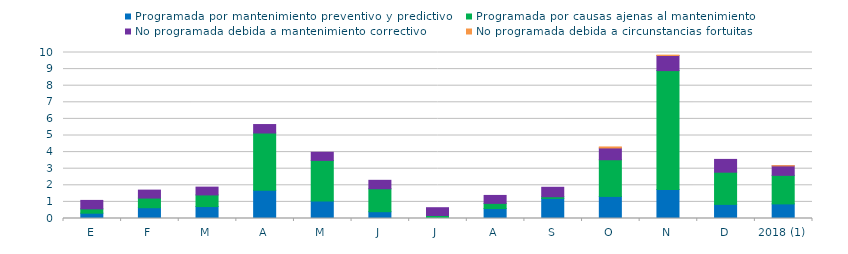
| Category | Programada por mantenimiento preventivo y predictivo | Programada por causas ajenas al mantenimiento  | No programada debida a mantenimiento correctivo  | No programada debida a circunstancias fortuitas  |
|---|---|---|---|---|
| E | 0.32 | 0.26 | 0.51 | 0 |
| F | 0.65 | 0.58 | 0.48 | 0 |
| M | 0.72 | 0.7 | 0.47 | 0 |
| A | 1.7 | 3.45 | 0.51 | 0 |
| M | 1.05 | 2.45 | 0.49 | 0 |
| J | 0.41 | 1.38 | 0.51 | 0 |
| J | 0.01 | 0.17 | 0.47 | 0 |
| A | 0.6 | 0.31 | 0.48 | 0 |
| S | 1.21 | 0.1 | 0.57 | 0 |
| O | 1.33 | 2.21 | 0.71 | 0.06 |
| N | 1.75 | 7.16 | 0.91 | 0.02 |
| D | 0.85 | 1.94 | 0.77 | 0 |
| 2018 (1) | 0.88 | 1.72 | 0.57 | 0.01 |